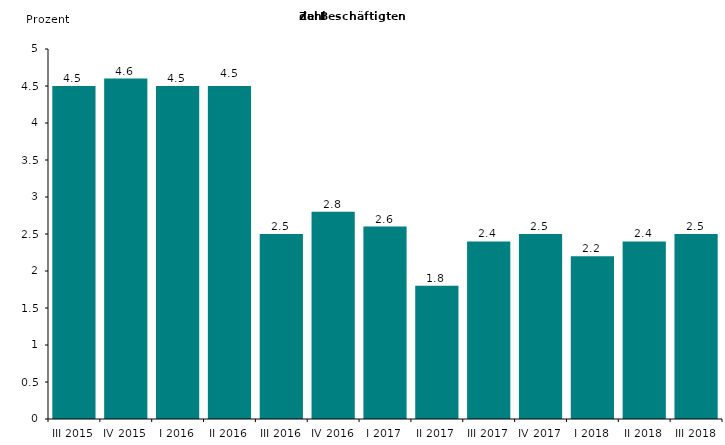
| Category | Series 0 |
|---|---|
| III 2015 | 4.5 |
| IV 2015 | 4.6 |
| I 2016 | 4.5 |
| II 2016 | 4.5 |
| III 2016 | 2.5 |
| IV 2016 | 2.8 |
| I 2017 | 2.6 |
| II 2017 | 1.8 |
| III 2017 | 2.4 |
| IV 2017 | 2.5 |
| I 2018 | 2.2 |
| II 2018 | 2.4 |
| III 2018 | 2.5 |